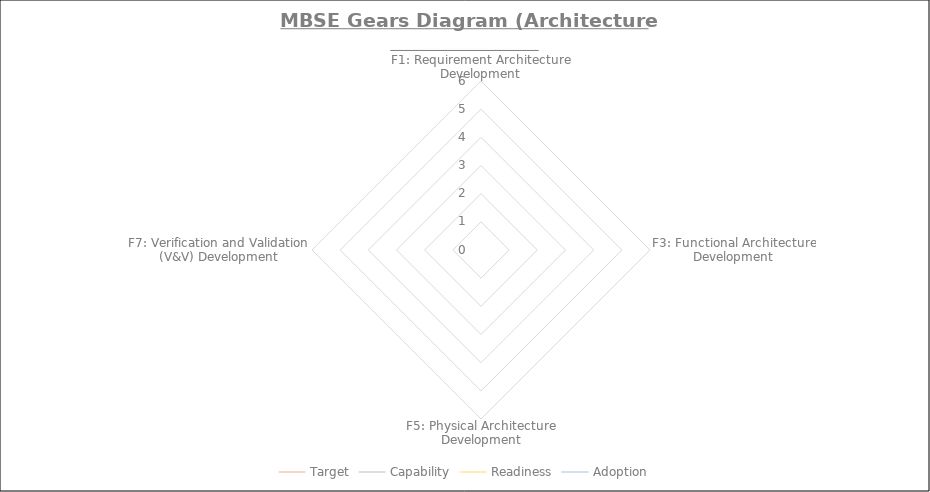
| Category | Target | Capability | Readiness | Adoption |
|---|---|---|---|---|
| F1: Requirement Architecture Development | 0 | 0 | 0 | 0 |
| F3: Functional Architecture Development | 0 | 0 | 0 | 0 |
| F5: Physical Architecture Development | 0 | 0 | 0 | 0 |
| F7: Verification and Validation (V&V) Development | 0 | 0 | 0 | 0 |